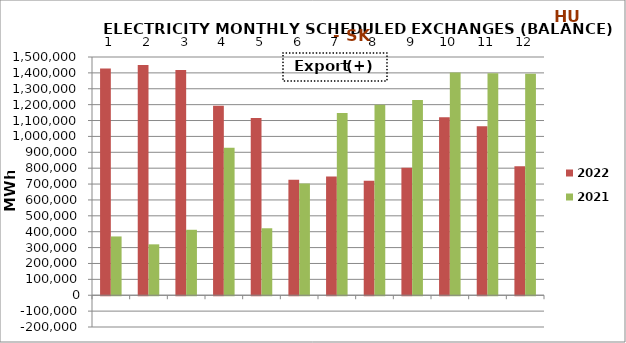
| Category | 2022 | 2021 |
|---|---|---|
| 0 | 1427269.4 | 370127.7 |
| 1 | 1449616.4 | 320439.5 |
| 2 | 1418433.3 | 412141.5 |
| 3 | 1193446.2 | 929019.4 |
| 4 | 1115427.9 | 421635.6 |
| 5 | 726641.6 | 703346.9 |
| 6 | 748162.1 | 1146991.3 |
| 7 | 721148.9 | 1199233.4 |
| 8 | 802188.7 | 1229888.8 |
| 9 | 1119913.9 | 1402498.5 |
| 10 | 1063413.375 | 1397493.7 |
| 11 | 812903.225 | 1395040.8 |